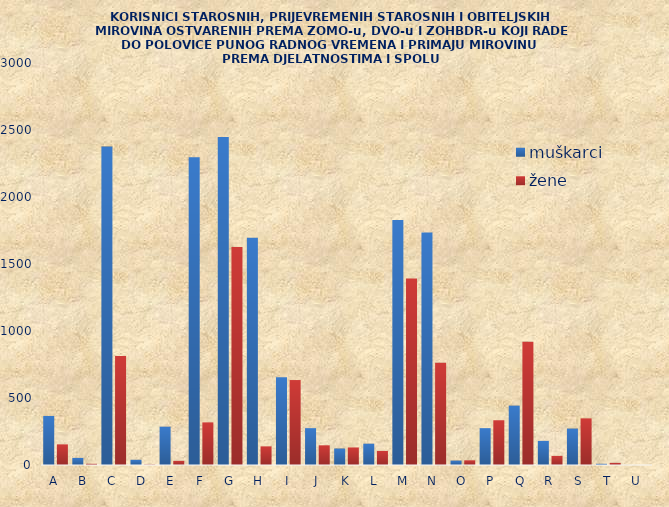
| Category | muškarci | žene |
|---|---|---|
| A | 366 | 154 |
| B | 53 | 9 |
| C | 2376 | 813 |
| D | 39 | 3 |
| E | 286 | 31 |
| F | 2296 | 318 |
| G | 2447 | 1627 |
| H | 1695 | 139 |
| I | 654 | 634 |
| J | 275 | 147 |
| K | 123 | 131 |
| L | 159 | 105 |
| M | 1829 | 1392 |
| N | 1736 | 763 |
| O | 33 | 35 |
| P | 275 | 334 |
| Q | 443 | 919 |
| R | 180 | 68 |
| S | 272 | 348 |
| T | 9 | 16 |
| U | 0 | 0 |